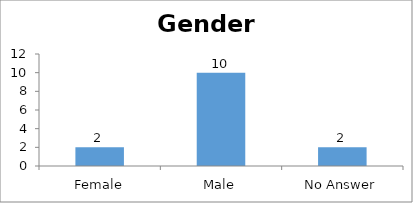
| Category | Gender |
|---|---|
| Female | 2 |
| Male | 10 |
| No Answer | 2 |